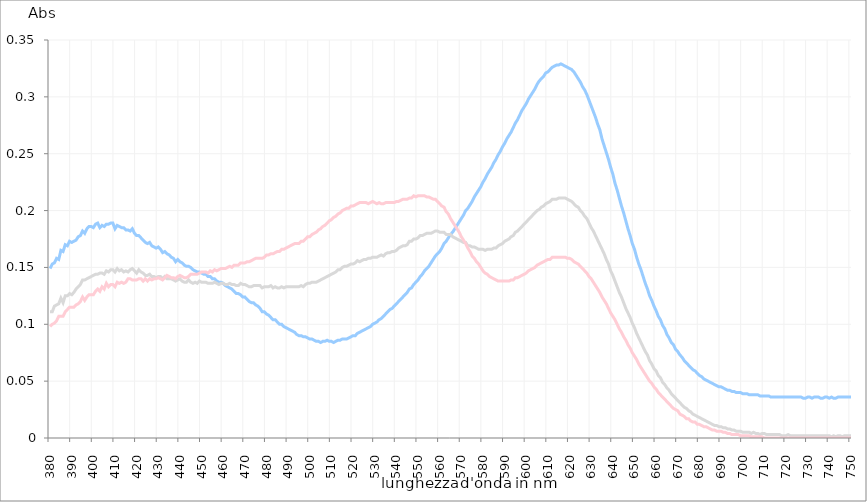
| Category | Series 0 | Series 1 | Series 2 |
|---|---|---|---|
| 380.0 | 0.149 | 0.111 | 0.098 |
| 381.0 | 0.153 | 0.111 | 0.1 |
| 382.0 | 0.154 | 0.116 | 0.101 |
| 383.0 | 0.158 | 0.117 | 0.103 |
| 384.0 | 0.157 | 0.118 | 0.107 |
| 385.0 | 0.165 | 0.123 | 0.107 |
| 386.0 | 0.164 | 0.119 | 0.107 |
| 387.0 | 0.17 | 0.125 | 0.111 |
| 388.0 | 0.169 | 0.125 | 0.113 |
| 389.0 | 0.173 | 0.127 | 0.115 |
| 390.0 | 0.172 | 0.126 | 0.115 |
| 391.0 | 0.173 | 0.128 | 0.115 |
| 392.0 | 0.174 | 0.131 | 0.117 |
| 393.0 | 0.177 | 0.133 | 0.118 |
| 394.0 | 0.178 | 0.135 | 0.12 |
| 395.0 | 0.182 | 0.139 | 0.124 |
| 396.0 | 0.18 | 0.139 | 0.121 |
| 397.0 | 0.184 | 0.14 | 0.124 |
| 398.0 | 0.186 | 0.141 | 0.126 |
| 399.0 | 0.186 | 0.142 | 0.126 |
| 400.0 | 0.185 | 0.143 | 0.126 |
| 401.0 | 0.188 | 0.144 | 0.129 |
| 402.0 | 0.189 | 0.144 | 0.131 |
| 403.0 | 0.185 | 0.145 | 0.129 |
| 404.0 | 0.187 | 0.145 | 0.133 |
| 405.0 | 0.186 | 0.144 | 0.131 |
| 406.0 | 0.188 | 0.147 | 0.136 |
| 407.0 | 0.188 | 0.146 | 0.133 |
| 408.0 | 0.189 | 0.148 | 0.135 |
| 409.0 | 0.189 | 0.148 | 0.135 |
| 410.0 | 0.184 | 0.146 | 0.133 |
| 411.0 | 0.187 | 0.149 | 0.137 |
| 412.0 | 0.186 | 0.147 | 0.136 |
| 413.0 | 0.185 | 0.148 | 0.137 |
| 414.0 | 0.185 | 0.146 | 0.136 |
| 415.0 | 0.183 | 0.147 | 0.137 |
| 416.0 | 0.183 | 0.146 | 0.14 |
| 417.0 | 0.182 | 0.148 | 0.14 |
| 418.0 | 0.184 | 0.149 | 0.139 |
| 419.0 | 0.18 | 0.147 | 0.139 |
| 420.0 | 0.178 | 0.145 | 0.139 |
| 421.0 | 0.178 | 0.148 | 0.14 |
| 422.0 | 0.176 | 0.146 | 0.14 |
| 423.0 | 0.174 | 0.145 | 0.138 |
| 424.0 | 0.172 | 0.143 | 0.14 |
| 425.0 | 0.171 | 0.143 | 0.138 |
| 426.0 | 0.172 | 0.144 | 0.14 |
| 427.0 | 0.169 | 0.142 | 0.139 |
| 428.0 | 0.168 | 0.142 | 0.14 |
| 429.0 | 0.167 | 0.141 | 0.14 |
| 430.0 | 0.168 | 0.142 | 0.141 |
| 431.0 | 0.166 | 0.142 | 0.14 |
| 432.0 | 0.163 | 0.14 | 0.139 |
| 433.0 | 0.164 | 0.142 | 0.141 |
| 434.0 | 0.162 | 0.14 | 0.143 |
| 435.0 | 0.161 | 0.14 | 0.142 |
| 436.0 | 0.159 | 0.14 | 0.141 |
| 437.0 | 0.158 | 0.139 | 0.141 |
| 438.0 | 0.155 | 0.138 | 0.14 |
| 439.0 | 0.157 | 0.139 | 0.142 |
| 440.0 | 0.155 | 0.14 | 0.143 |
| 441.0 | 0.154 | 0.138 | 0.142 |
| 442.0 | 0.152 | 0.137 | 0.141 |
| 443.0 | 0.151 | 0.137 | 0.141 |
| 444.0 | 0.151 | 0.139 | 0.142 |
| 445.0 | 0.15 | 0.137 | 0.144 |
| 446.0 | 0.148 | 0.136 | 0.144 |
| 447.0 | 0.147 | 0.137 | 0.144 |
| 448.0 | 0.146 | 0.136 | 0.144 |
| 449.0 | 0.146 | 0.138 | 0.145 |
| 450.0 | 0.145 | 0.137 | 0.146 |
| 451.0 | 0.144 | 0.137 | 0.146 |
| 452.0 | 0.144 | 0.137 | 0.146 |
| 453.0 | 0.142 | 0.136 | 0.145 |
| 454.0 | 0.142 | 0.136 | 0.147 |
| 455.0 | 0.14 | 0.136 | 0.146 |
| 456.0 | 0.14 | 0.137 | 0.148 |
| 457.0 | 0.138 | 0.136 | 0.147 |
| 458.0 | 0.137 | 0.135 | 0.148 |
| 459.0 | 0.137 | 0.136 | 0.149 |
| 460.0 | 0.136 | 0.136 | 0.149 |
| 461.0 | 0.134 | 0.135 | 0.149 |
| 462.0 | 0.133 | 0.135 | 0.15 |
| 463.0 | 0.132 | 0.136 | 0.151 |
| 464.0 | 0.131 | 0.135 | 0.15 |
| 465.0 | 0.129 | 0.135 | 0.152 |
| 466.0 | 0.127 | 0.134 | 0.152 |
| 467.0 | 0.127 | 0.134 | 0.152 |
| 468.0 | 0.126 | 0.136 | 0.154 |
| 469.0 | 0.124 | 0.135 | 0.154 |
| 470.0 | 0.124 | 0.135 | 0.154 |
| 471.0 | 0.122 | 0.134 | 0.155 |
| 472.0 | 0.12 | 0.133 | 0.155 |
| 473.0 | 0.119 | 0.133 | 0.156 |
| 474.0 | 0.119 | 0.134 | 0.157 |
| 475.0 | 0.117 | 0.134 | 0.158 |
| 476.0 | 0.116 | 0.134 | 0.158 |
| 477.0 | 0.114 | 0.134 | 0.158 |
| 478.0 | 0.111 | 0.132 | 0.158 |
| 479.0 | 0.111 | 0.133 | 0.159 |
| 480.0 | 0.109 | 0.133 | 0.161 |
| 481.0 | 0.108 | 0.133 | 0.161 |
| 482.0 | 0.106 | 0.134 | 0.162 |
| 483.0 | 0.104 | 0.132 | 0.162 |
| 484.0 | 0.104 | 0.133 | 0.163 |
| 485.0 | 0.102 | 0.132 | 0.164 |
| 486.0 | 0.1 | 0.132 | 0.164 |
| 487.0 | 0.1 | 0.133 | 0.166 |
| 488.0 | 0.098 | 0.132 | 0.166 |
| 489.0 | 0.097 | 0.133 | 0.167 |
| 490.0 | 0.096 | 0.133 | 0.168 |
| 491.0 | 0.095 | 0.133 | 0.169 |
| 492.0 | 0.094 | 0.133 | 0.17 |
| 493.0 | 0.093 | 0.133 | 0.171 |
| 494.0 | 0.091 | 0.133 | 0.171 |
| 495.0 | 0.09 | 0.133 | 0.171 |
| 496.0 | 0.09 | 0.134 | 0.173 |
| 497.0 | 0.089 | 0.133 | 0.173 |
| 498.0 | 0.089 | 0.135 | 0.175 |
| 499.0 | 0.088 | 0.136 | 0.177 |
| 500.0 | 0.087 | 0.136 | 0.177 |
| 501.0 | 0.087 | 0.137 | 0.179 |
| 502.0 | 0.086 | 0.137 | 0.18 |
| 503.0 | 0.085 | 0.137 | 0.181 |
| 504.0 | 0.085 | 0.138 | 0.183 |
| 505.0 | 0.084 | 0.139 | 0.184 |
| 506.0 | 0.085 | 0.14 | 0.186 |
| 507.0 | 0.085 | 0.141 | 0.187 |
| 508.0 | 0.086 | 0.142 | 0.189 |
| 509.0 | 0.085 | 0.143 | 0.191 |
| 510.0 | 0.085 | 0.144 | 0.192 |
| 511.0 | 0.084 | 0.145 | 0.194 |
| 512.0 | 0.085 | 0.146 | 0.195 |
| 513.0 | 0.086 | 0.148 | 0.197 |
| 514.0 | 0.086 | 0.148 | 0.198 |
| 515.0 | 0.087 | 0.15 | 0.2 |
| 516.0 | 0.087 | 0.151 | 0.201 |
| 517.0 | 0.087 | 0.151 | 0.202 |
| 518.0 | 0.088 | 0.152 | 0.202 |
| 519.0 | 0.089 | 0.153 | 0.204 |
| 520.0 | 0.09 | 0.153 | 0.204 |
| 521.0 | 0.09 | 0.154 | 0.205 |
| 522.0 | 0.092 | 0.156 | 0.206 |
| 523.0 | 0.093 | 0.155 | 0.207 |
| 524.0 | 0.094 | 0.156 | 0.207 |
| 525.0 | 0.095 | 0.157 | 0.207 |
| 526.0 | 0.096 | 0.157 | 0.207 |
| 527.0 | 0.097 | 0.158 | 0.206 |
| 528.0 | 0.098 | 0.158 | 0.207 |
| 529.0 | 0.1 | 0.159 | 0.208 |
| 530.0 | 0.101 | 0.159 | 0.207 |
| 531.0 | 0.102 | 0.159 | 0.206 |
| 532.0 | 0.104 | 0.16 | 0.207 |
| 533.0 | 0.105 | 0.161 | 0.206 |
| 534.0 | 0.107 | 0.16 | 0.206 |
| 535.0 | 0.109 | 0.162 | 0.207 |
| 536.0 | 0.111 | 0.163 | 0.207 |
| 537.0 | 0.113 | 0.163 | 0.207 |
| 538.0 | 0.114 | 0.164 | 0.207 |
| 539.0 | 0.116 | 0.164 | 0.207 |
| 540.0 | 0.118 | 0.165 | 0.208 |
| 541.0 | 0.12 | 0.167 | 0.208 |
| 542.0 | 0.122 | 0.168 | 0.209 |
| 543.0 | 0.124 | 0.169 | 0.21 |
| 544.0 | 0.126 | 0.169 | 0.21 |
| 545.0 | 0.128 | 0.17 | 0.21 |
| 546.0 | 0.131 | 0.173 | 0.211 |
| 547.0 | 0.132 | 0.173 | 0.211 |
| 548.0 | 0.135 | 0.175 | 0.213 |
| 549.0 | 0.137 | 0.175 | 0.212 |
| 550.0 | 0.139 | 0.176 | 0.213 |
| 551.0 | 0.142 | 0.178 | 0.213 |
| 552.0 | 0.144 | 0.178 | 0.213 |
| 553.0 | 0.147 | 0.179 | 0.213 |
| 554.0 | 0.149 | 0.18 | 0.212 |
| 555.0 | 0.151 | 0.18 | 0.212 |
| 556.0 | 0.154 | 0.18 | 0.211 |
| 557.0 | 0.157 | 0.181 | 0.21 |
| 558.0 | 0.16 | 0.182 | 0.21 |
| 559.0 | 0.162 | 0.182 | 0.208 |
| 560.0 | 0.164 | 0.181 | 0.206 |
| 561.0 | 0.167 | 0.181 | 0.204 |
| 562.0 | 0.171 | 0.181 | 0.203 |
| 563.0 | 0.173 | 0.179 | 0.199 |
| 564.0 | 0.176 | 0.179 | 0.197 |
| 565.0 | 0.179 | 0.179 | 0.193 |
| 566.0 | 0.181 | 0.177 | 0.19 |
| 567.0 | 0.184 | 0.176 | 0.187 |
| 568.0 | 0.187 | 0.175 | 0.184 |
| 569.0 | 0.19 | 0.174 | 0.181 |
| 570.0 | 0.193 | 0.173 | 0.177 |
| 571.0 | 0.196 | 0.172 | 0.174 |
| 572.0 | 0.2 | 0.172 | 0.171 |
| 573.0 | 0.202 | 0.169 | 0.167 |
| 574.0 | 0.205 | 0.169 | 0.164 |
| 575.0 | 0.208 | 0.168 | 0.16 |
| 576.0 | 0.212 | 0.168 | 0.158 |
| 577.0 | 0.215 | 0.167 | 0.155 |
| 578.0 | 0.218 | 0.166 | 0.153 |
| 579.0 | 0.221 | 0.166 | 0.15 |
| 580.0 | 0.225 | 0.166 | 0.147 |
| 581.0 | 0.228 | 0.165 | 0.145 |
| 582.0 | 0.232 | 0.166 | 0.144 |
| 583.0 | 0.235 | 0.166 | 0.142 |
| 584.0 | 0.238 | 0.166 | 0.141 |
| 585.0 | 0.242 | 0.167 | 0.14 |
| 586.0 | 0.245 | 0.167 | 0.139 |
| 587.0 | 0.249 | 0.169 | 0.138 |
| 588.0 | 0.252 | 0.17 | 0.138 |
| 589.0 | 0.256 | 0.171 | 0.138 |
| 590.0 | 0.259 | 0.173 | 0.138 |
| 591.0 | 0.263 | 0.174 | 0.138 |
| 592.0 | 0.266 | 0.175 | 0.138 |
| 593.0 | 0.269 | 0.177 | 0.139 |
| 594.0 | 0.273 | 0.178 | 0.139 |
| 595.0 | 0.277 | 0.181 | 0.141 |
| 596.0 | 0.28 | 0.182 | 0.141 |
| 597.0 | 0.284 | 0.184 | 0.142 |
| 598.0 | 0.288 | 0.186 | 0.143 |
| 599.0 | 0.291 | 0.188 | 0.144 |
| 600.0 | 0.294 | 0.19 | 0.145 |
| 601.0 | 0.298 | 0.192 | 0.147 |
| 602.0 | 0.301 | 0.194 | 0.148 |
| 603.0 | 0.304 | 0.196 | 0.149 |
| 604.0 | 0.307 | 0.198 | 0.15 |
| 605.0 | 0.311 | 0.2 | 0.152 |
| 606.0 | 0.314 | 0.201 | 0.153 |
| 607.0 | 0.316 | 0.203 | 0.154 |
| 608.0 | 0.318 | 0.204 | 0.155 |
| 609.0 | 0.321 | 0.206 | 0.156 |
| 610.0 | 0.322 | 0.207 | 0.157 |
| 611.0 | 0.324 | 0.208 | 0.157 |
| 612.0 | 0.326 | 0.21 | 0.159 |
| 613.0 | 0.327 | 0.21 | 0.159 |
| 614.0 | 0.328 | 0.21 | 0.159 |
| 615.0 | 0.328 | 0.211 | 0.159 |
| 616.0 | 0.329 | 0.211 | 0.159 |
| 617.0 | 0.328 | 0.211 | 0.159 |
| 618.0 | 0.327 | 0.211 | 0.159 |
| 619.0 | 0.326 | 0.21 | 0.158 |
| 620.0 | 0.325 | 0.209 | 0.158 |
| 621.0 | 0.324 | 0.208 | 0.157 |
| 622.0 | 0.322 | 0.206 | 0.155 |
| 623.0 | 0.319 | 0.204 | 0.154 |
| 624.0 | 0.316 | 0.203 | 0.153 |
| 625.0 | 0.313 | 0.2 | 0.151 |
| 626.0 | 0.309 | 0.198 | 0.149 |
| 627.0 | 0.306 | 0.195 | 0.147 |
| 628.0 | 0.302 | 0.193 | 0.145 |
| 629.0 | 0.297 | 0.189 | 0.142 |
| 630.0 | 0.292 | 0.185 | 0.14 |
| 631.0 | 0.287 | 0.182 | 0.137 |
| 632.0 | 0.282 | 0.178 | 0.134 |
| 633.0 | 0.276 | 0.174 | 0.131 |
| 634.0 | 0.271 | 0.17 | 0.128 |
| 635.0 | 0.263 | 0.166 | 0.124 |
| 636.0 | 0.257 | 0.162 | 0.121 |
| 637.0 | 0.251 | 0.157 | 0.118 |
| 638.0 | 0.245 | 0.153 | 0.114 |
| 639.0 | 0.238 | 0.147 | 0.11 |
| 640.0 | 0.232 | 0.143 | 0.107 |
| 641.0 | 0.224 | 0.138 | 0.104 |
| 642.0 | 0.218 | 0.133 | 0.1 |
| 643.0 | 0.211 | 0.128 | 0.096 |
| 644.0 | 0.204 | 0.124 | 0.093 |
| 645.0 | 0.198 | 0.119 | 0.089 |
| 646.0 | 0.191 | 0.114 | 0.086 |
| 647.0 | 0.184 | 0.11 | 0.082 |
| 648.0 | 0.178 | 0.106 | 0.079 |
| 649.0 | 0.171 | 0.101 | 0.075 |
| 650.0 | 0.166 | 0.097 | 0.072 |
| 651.0 | 0.159 | 0.092 | 0.069 |
| 652.0 | 0.153 | 0.088 | 0.065 |
| 653.0 | 0.148 | 0.084 | 0.062 |
| 654.0 | 0.142 | 0.08 | 0.059 |
| 655.0 | 0.136 | 0.076 | 0.056 |
| 656.0 | 0.131 | 0.073 | 0.053 |
| 657.0 | 0.125 | 0.068 | 0.05 |
| 658.0 | 0.121 | 0.065 | 0.048 |
| 659.0 | 0.116 | 0.061 | 0.045 |
| 660.0 | 0.112 | 0.059 | 0.043 |
| 661.0 | 0.107 | 0.055 | 0.04 |
| 662.0 | 0.104 | 0.053 | 0.038 |
| 663.0 | 0.099 | 0.049 | 0.036 |
| 664.0 | 0.096 | 0.047 | 0.034 |
| 665.0 | 0.091 | 0.044 | 0.032 |
| 666.0 | 0.088 | 0.042 | 0.03 |
| 667.0 | 0.084 | 0.039 | 0.028 |
| 668.0 | 0.082 | 0.037 | 0.026 |
| 669.0 | 0.078 | 0.035 | 0.025 |
| 670.0 | 0.076 | 0.033 | 0.024 |
| 671.0 | 0.073 | 0.031 | 0.021 |
| 672.0 | 0.071 | 0.029 | 0.02 |
| 673.0 | 0.068 | 0.027 | 0.019 |
| 674.0 | 0.066 | 0.026 | 0.017 |
| 675.0 | 0.064 | 0.024 | 0.017 |
| 676.0 | 0.062 | 0.023 | 0.015 |
| 677.0 | 0.06 | 0.021 | 0.014 |
| 678.0 | 0.059 | 0.02 | 0.014 |
| 679.0 | 0.057 | 0.019 | 0.012 |
| 680.0 | 0.055 | 0.018 | 0.012 |
| 681.0 | 0.054 | 0.017 | 0.011 |
| 682.0 | 0.052 | 0.016 | 0.01 |
| 683.0 | 0.051 | 0.015 | 0.01 |
| 684.0 | 0.05 | 0.014 | 0.009 |
| 685.0 | 0.049 | 0.013 | 0.008 |
| 686.0 | 0.048 | 0.012 | 0.007 |
| 687.0 | 0.047 | 0.011 | 0.007 |
| 688.0 | 0.046 | 0.011 | 0.006 |
| 689.0 | 0.045 | 0.01 | 0.006 |
| 690.0 | 0.045 | 0.01 | 0.006 |
| 691.0 | 0.044 | 0.009 | 0.005 |
| 692.0 | 0.043 | 0.009 | 0.005 |
| 693.0 | 0.042 | 0.008 | 0.004 |
| 694.0 | 0.042 | 0.008 | 0.004 |
| 695.0 | 0.041 | 0.007 | 0.003 |
| 696.0 | 0.041 | 0.007 | 0.003 |
| 697.0 | 0.04 | 0.006 | 0.003 |
| 698.0 | 0.04 | 0.006 | 0.003 |
| 699.0 | 0.04 | 0.006 | 0.002 |
| 700.0 | 0.039 | 0.005 | 0.002 |
| 701.0 | 0.039 | 0.005 | 0.002 |
| 702.0 | 0.039 | 0.005 | 0.002 |
| 703.0 | 0.038 | 0.005 | 0.002 |
| 704.0 | 0.038 | 0.004 | 0.001 |
| 705.0 | 0.038 | 0.005 | 0.001 |
| 706.0 | 0.038 | 0.004 | 0.001 |
| 707.0 | 0.038 | 0.004 | 0.001 |
| 708.0 | 0.037 | 0.003 | 0.001 |
| 709.0 | 0.037 | 0.004 | 0.001 |
| 710.0 | 0.037 | 0.004 | 0 |
| 711.0 | 0.037 | 0.003 | 0 |
| 712.0 | 0.037 | 0.003 | 0 |
| 713.0 | 0.036 | 0.003 | 0 |
| 714.0 | 0.036 | 0.003 | 0 |
| 715.0 | 0.036 | 0.003 | 0 |
| 716.0 | 0.036 | 0.003 | 0 |
| 717.0 | 0.036 | 0.003 | 0 |
| 718.0 | 0.036 | 0.002 | 0 |
| 719.0 | 0.036 | 0.002 | 0 |
| 720.0 | 0.036 | 0.002 | 0 |
| 721.0 | 0.036 | 0.003 | 0 |
| 722.0 | 0.036 | 0.002 | 0 |
| 723.0 | 0.036 | 0.002 | 0 |
| 724.0 | 0.036 | 0.002 | 0 |
| 725.0 | 0.036 | 0.002 | 0 |
| 726.0 | 0.036 | 0.002 | 0 |
| 727.0 | 0.036 | 0.002 | 0 |
| 728.0 | 0.035 | 0.002 | 0 |
| 729.0 | 0.035 | 0.002 | 0 |
| 730.0 | 0.036 | 0.002 | 0 |
| 731.0 | 0.036 | 0.002 | 0 |
| 732.0 | 0.035 | 0.002 | 0 |
| 733.0 | 0.036 | 0.002 | 0 |
| 734.0 | 0.036 | 0.002 | 0 |
| 735.0 | 0.036 | 0.002 | 0 |
| 736.0 | 0.035 | 0.002 | 0 |
| 737.0 | 0.035 | 0.002 | 0 |
| 738.0 | 0.036 | 0.002 | 0 |
| 739.0 | 0.036 | 0.002 | 0 |
| 740.0 | 0.035 | 0.002 | 0 |
| 741.0 | 0.036 | 0.001 | 0 |
| 742.0 | 0.035 | 0.002 | 0 |
| 743.0 | 0.035 | 0.001 | 0 |
| 744.0 | 0.036 | 0.002 | 0 |
| 745.0 | 0.036 | 0.002 | 0 |
| 746.0 | 0.036 | 0.001 | 0 |
| 747.0 | 0.036 | 0.002 | 0 |
| 748.0 | 0.036 | 0.002 | 0 |
| 749.0 | 0.036 | 0.002 | 0 |
| 750.0 | 0.036 | 0.002 | 0 |